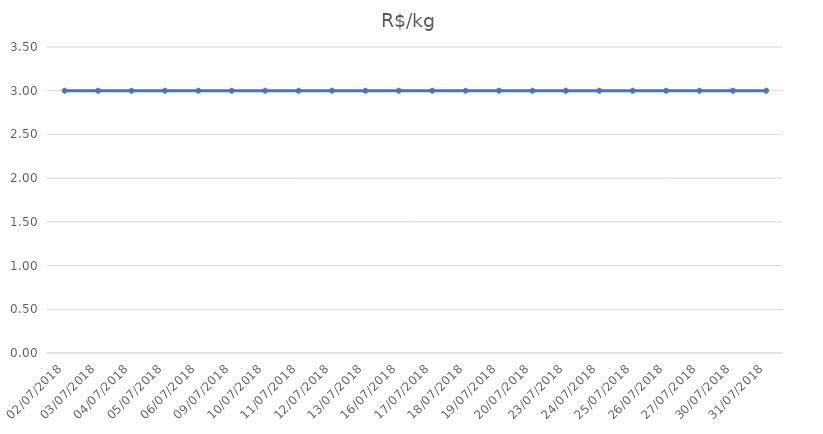
| Category | R$/kg |
|---|---|
| 02/07/2018 | 3 |
| 03/07/2018 | 3 |
| 04/07/2018 | 3 |
| 05/07/2018 | 3 |
| 06/07/2018 | 3 |
| 09/07/2018 | 3 |
| 10/07/2018 | 3 |
| 11/07/2018 | 3 |
| 12/07/2018 | 3 |
| 13/07/2018 | 3 |
| 16/07/2018 | 3 |
| 17/07/2018 | 3 |
| 18/07/2018 | 3 |
| 19/07/2018 | 3 |
| 20/07/2018 | 3 |
| 23/07/2018 | 3 |
| 24/07/2018 | 3 |
| 25/07/2018 | 3 |
| 26/07/2018 | 3 |
| 27/07/2018 | 3 |
| 30/07/2018 | 3 |
| 31/07/2018 | 3 |